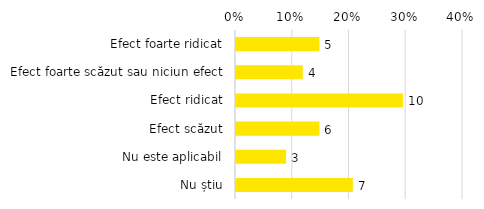
| Category | Total |
|---|---|
| Efect foarte ridicat | 0.147 |
| Efect foarte scăzut sau niciun efect | 0.118 |
| Efect ridicat | 0.294 |
| Efect scăzut | 0.147 |
| Nu este aplicabil | 0.088 |
| Nu știu | 0.206 |